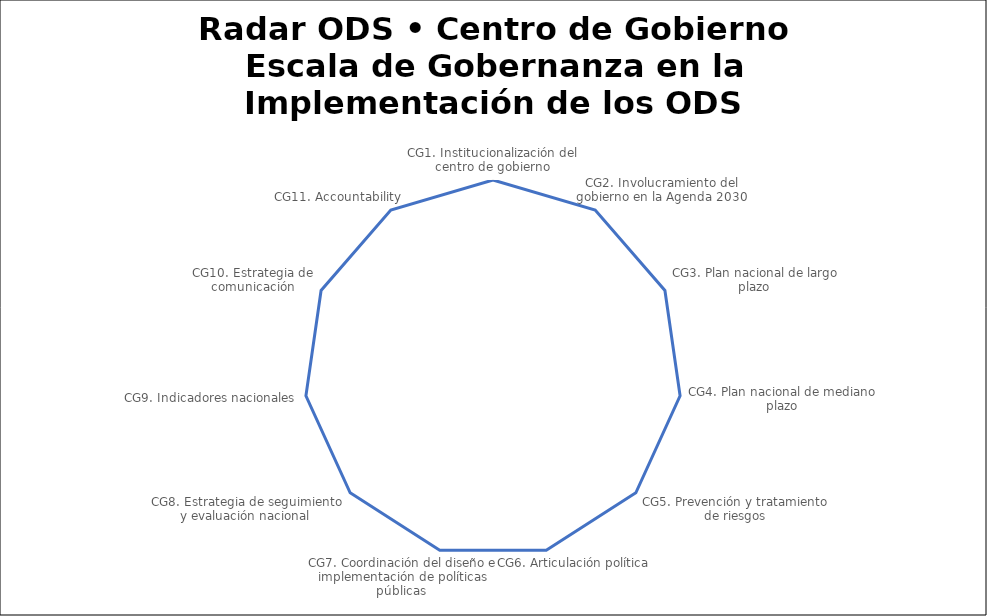
| Category | Series 0 |
|---|---|
| CG1. Institucionalización del centro de gobierno | 0 |
| CG2. Involucramiento del gobierno en la Agenda 2030 | 0 |
| CG3. Plan nacional de largo plazo  | 0 |
| CG4. Plan nacional de mediano plazo | 0 |
| CG5. Prevención y tratamiento de riesgos | 0 |
| CG6. Articulación política  | 0 |
| CG7. Coordinación del diseño e implementación de políticas públicas  | 0 |
| CG8. Estrategia de seguimiento y evaluación nacional  | 0 |
| CG9. Indicadores nacionales | 0 |
| CG10. Estrategia de comunicación | 0 |
| CG11. Accountability | 0 |